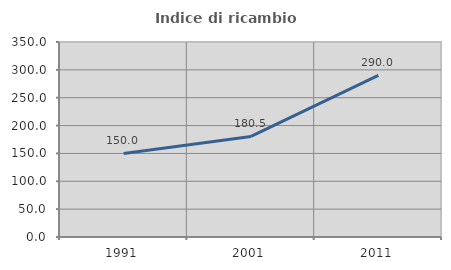
| Category | Indice di ricambio occupazionale  |
|---|---|
| 1991.0 | 150 |
| 2001.0 | 180.488 |
| 2011.0 | 290 |